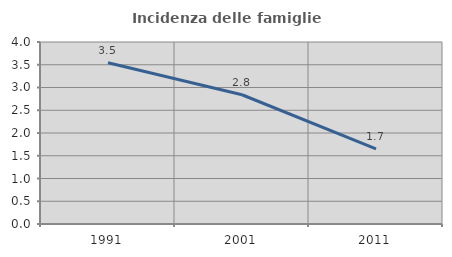
| Category | Incidenza delle famiglie numerose |
|---|---|
| 1991.0 | 3.542 |
| 2001.0 | 2.841 |
| 2011.0 | 1.653 |